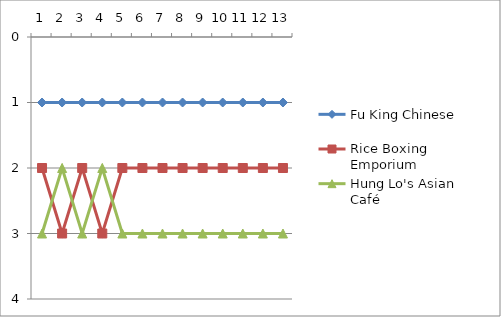
| Category | Fu King Chinese | Rice Boxing Emporium | Hung Lo's Asian Café |
|---|---|---|---|
| 0 | 1 | 2 | 3 |
| 1 | 1 | 3 | 2 |
| 2 | 1 | 2 | 3 |
| 3 | 1 | 3 | 2 |
| 4 | 1 | 2 | 3 |
| 5 | 1 | 2 | 3 |
| 6 | 1 | 2 | 3 |
| 7 | 1 | 2 | 3 |
| 8 | 1 | 2 | 3 |
| 9 | 1 | 2 | 3 |
| 10 | 1 | 2 | 3 |
| 11 | 1 | 2 | 3 |
| 12 | 1 | 2 | 3 |